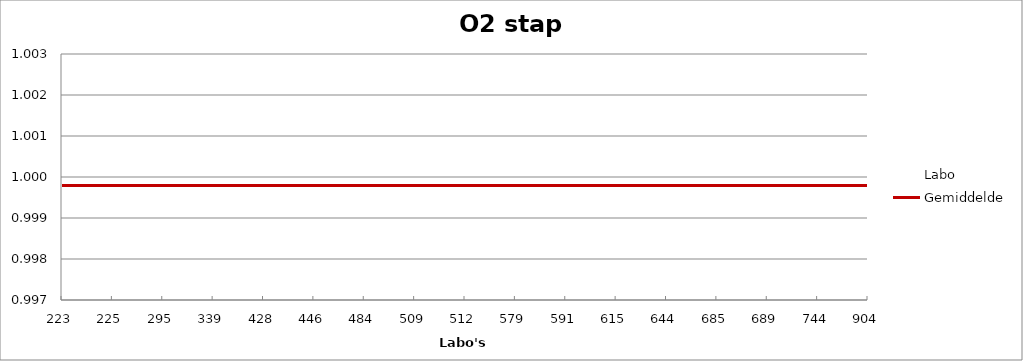
| Category | Labo | Gemiddelde |
|---|---|---|
| 223.0 | 1.001 | 1 |
| 225.0 | 1 | 1 |
| 295.0 | 1 | 1 |
| 339.0 | 1 | 1 |
| 428.0 | 1 | 1 |
| 446.0 | 0.999 | 1 |
| 484.0 | 1.001 | 1 |
| 509.0 | 1 | 1 |
| 512.0 | 0.999 | 1 |
| 579.0 | 1 | 1 |
| 591.0 | 1 | 1 |
| 615.0 | 1 | 1 |
| 644.0 | 1 | 1 |
| 685.0 | 0.999 | 1 |
| 689.0 | 1 | 1 |
| 744.0 | 1 | 1 |
| 904.0 | 0.999 | 1 |